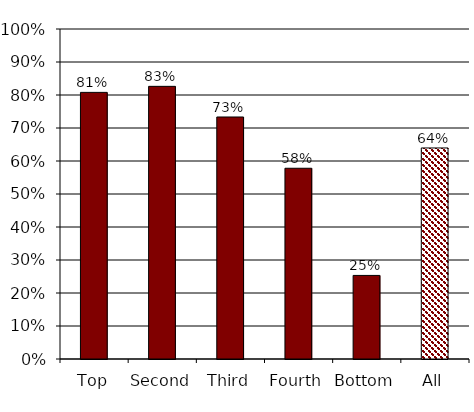
| Category | Series 0 |
|---|---|
| Top | 0.808 |
| Second | 0.826 |
| Third | 0.733 |
| Fourth | 0.578 |
| Bottom | 0.253 |
| All | 0.64 |